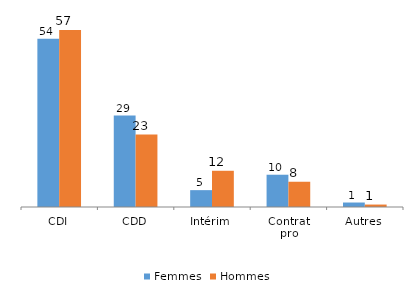
| Category | Femmes | Hommes |
|---|---|---|
| CDI | 53.72 | 56.51 |
| CDD | 29.17 | 23.1 |
| Intérim | 5.38 | 11.56 |
| Contrat
pro | 10.3 | 8.06 |
| Autres | 1.43 | 0.78 |